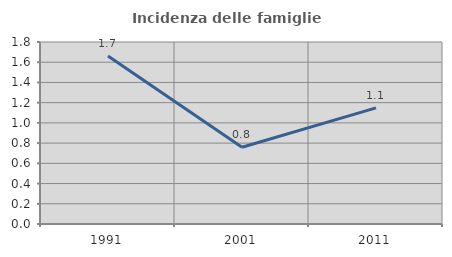
| Category | Incidenza delle famiglie numerose |
|---|---|
| 1991.0 | 1.662 |
| 2001.0 | 0.759 |
| 2011.0 | 1.148 |